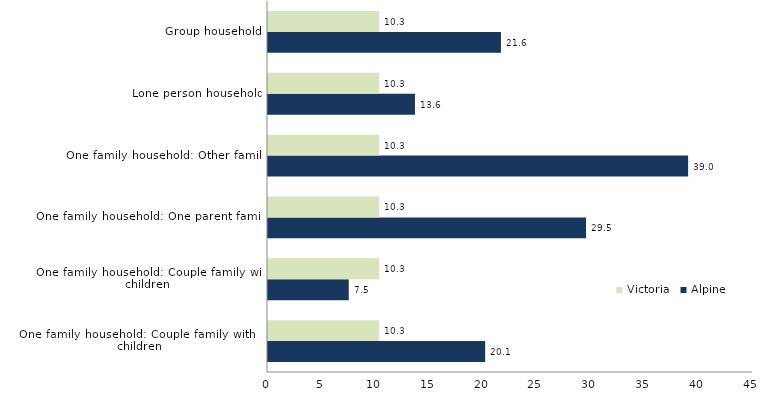
| Category | Alpine  | Victoria |
|---|---|---|
| One family household: Couple family with no children | 20.15 | 10.314 |
| One family household: Couple family with children | 7.493 | 10.314 |
| One family household: One parent family | 29.508 | 10.314 |
| One family household: Other family | 38.98 | 10.314 |
| Lone person household | 13.636 | 10.314 |
| Group household | 21.613 | 10.314 |